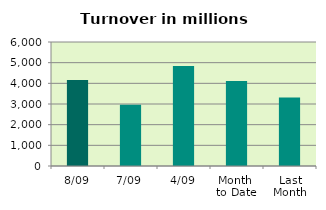
| Category | Series 0 |
|---|---|
| 8/09 | 4163.279 |
| 7/09 | 2966.013 |
| 4/09 | 4835.492 |
| Month 
to Date | 4117.062 |
| Last
Month | 3319.434 |